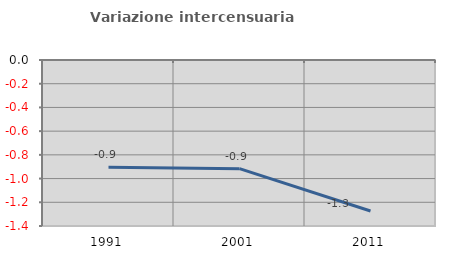
| Category | Variazione intercensuaria annua |
|---|---|
| 1991.0 | -0.905 |
| 2001.0 | -0.916 |
| 2011.0 | -1.273 |